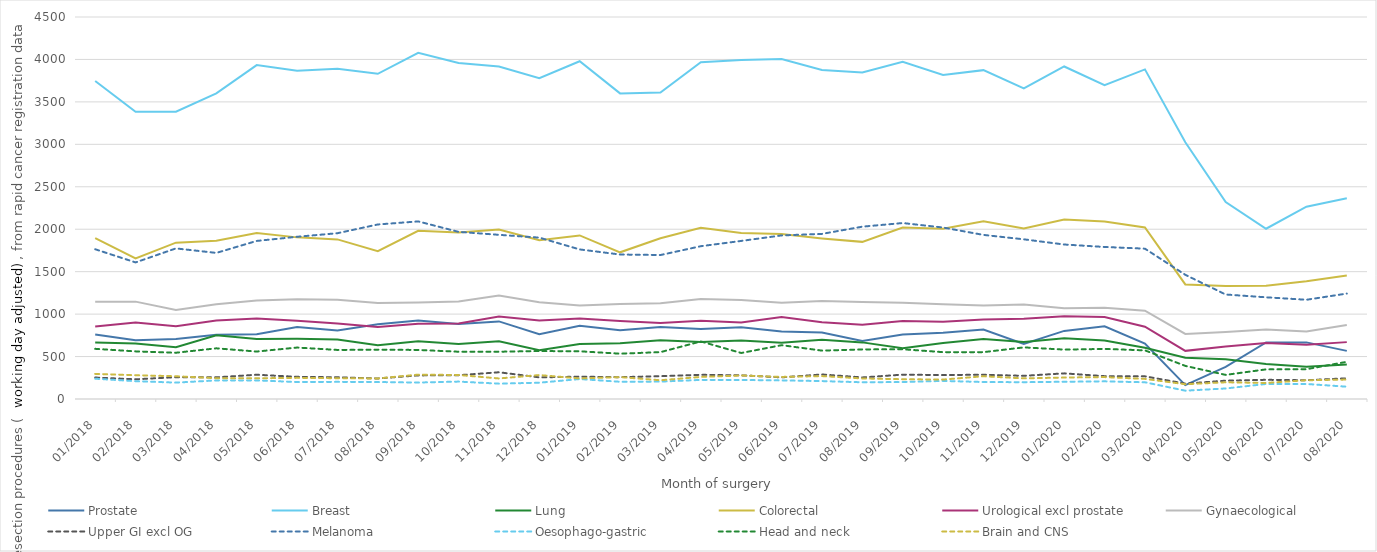
| Category | Prostate | Breast | Lung | Colorectal | Urological excl prostate | Gynaecological | Upper GI excl OG | Melanoma | Oesophago-gastric | Head and neck | Brain and CNS |
|---|---|---|---|---|---|---|---|---|---|---|---|
| 2018-01-01 | 761 | 3746 | 665 | 1895 | 854 | 1147 | 253 | 1764 | 239 | 591 | 296 |
| 2018-02-01 | 691 | 3384 | 655 | 1655 | 901 | 1147 | 232 | 1609 | 210 | 561 | 280 |
| 2018-03-01 | 706 | 3385 | 609 | 1842 | 856 | 1049 | 257 | 1774 | 193 | 545 | 268 |
| 2018-04-01 | 756 | 3600 | 751 | 1865 | 926 | 1116 | 255 | 1721 | 219 | 597 | 245 |
| 2018-05-01 | 764 | 3933 | 708 | 1954 | 947 | 1160 | 286 | 1862 | 219 | 559 | 244 |
| 2018-06-01 | 849 | 3867 | 709 | 1904 | 923 | 1176 | 261 | 1911 | 200 | 606 | 249 |
| 2018-07-01 | 807 | 3889 | 702 | 1880 | 888 | 1169 | 256 | 1953 | 202 | 578 | 245 |
| 2018-08-01 | 880 | 3831 | 634 | 1741 | 849 | 1131 | 242 | 2056 | 200 | 581 | 242 |
| 2018-09-01 | 925 | 4078 | 681 | 1981 | 887 | 1136 | 278 | 2092 | 194 | 578 | 287 |
| 2018-10-01 | 885 | 3959 | 648 | 1960 | 889 | 1148 | 280 | 1969 | 205 | 557 | 283 |
| 2018-11-01 | 914 | 3916 | 680 | 1996 | 972 | 1218 | 315 | 1934 | 181 | 557 | 242 |
| 2018-12-01 | 764 | 3779 | 575 | 1871 | 926 | 1141 | 255 | 1901 | 192 | 565 | 282 |
| 2019-01-01 | 863 | 3979 | 649 | 1927 | 949 | 1102 | 263 | 1762 | 235 | 562 | 242 |
| 2019-02-01 | 809 | 3600 | 656 | 1728 | 919 | 1118 | 257 | 1702 | 203 | 534 | 258 |
| 2019-03-01 | 847 | 3611 | 693 | 1894 | 896 | 1127 | 269 | 1696 | 205 | 552 | 221 |
| 2019-04-01 | 826 | 3967 | 671 | 2017 | 922 | 1179 | 285 | 1800 | 225 | 678 | 260 |
| 2019-05-01 | 845 | 3992 | 689 | 1955 | 900 | 1166 | 279 | 1862 | 224 | 542 | 277 |
| 2019-06-01 | 794 | 4004 | 662 | 1943 | 966 | 1133 | 255 | 1927 | 219 | 634 | 260 |
| 2019-07-01 | 782 | 3877 | 699 | 1892 | 905 | 1153 | 289 | 1945 | 211 | 570 | 270 |
| 2019-08-01 | 684 | 3847 | 667 | 1851 | 876 | 1142 | 254 | 2030 | 197 | 584 | 242 |
| 2019-09-01 | 761 | 3972 | 599 | 2020 | 919 | 1133 | 287 | 2073 | 200 | 586 | 233 |
| 2019-10-01 | 780 | 3818 | 660 | 2006 | 910 | 1116 | 282 | 2020 | 213 | 552 | 229 |
| 2019-11-01 | 818 | 3874 | 708 | 2095 | 937 | 1102 | 286 | 1933 | 200 | 552 | 268 |
| 2019-12-01 | 648 | 3658 | 672 | 2010 | 944 | 1113 | 273 | 1881 | 198 | 608 | 243 |
| 2020-01-01 | 802 | 3917 | 717 | 2114 | 976 | 1068 | 302 | 1820 | 203 | 582 | 253 |
| 2020-02-01 | 856 | 3697 | 690 | 2092 | 965 | 1076 | 269 | 1791 | 208 | 590 | 258 |
| 2020-03-01 | 653 | 3883 | 604 | 2021 | 851 | 1040 | 267 | 1771 | 197 | 573 | 237 |
| 2020-04-01 | 164 | 3025 | 487 | 1350 | 567 | 767 | 181 | 1463 | 98 | 390 | 174 |
| 2020-05-01 | 378 | 2321 | 468 | 1331 | 619 | 790 | 216 | 1231 | 124 | 284 | 197 |
| 2020-06-01 | 667 | 2006 | 411 | 1334 | 661 | 820 | 226 | 1198 | 177 | 349 | 189 |
| 2020-07-01 | 667 | 2265 | 381 | 1386 | 638 | 795 | 221 | 1169 | 177 | 351 | 221 |
| 2020-08-01 | 567 | 2364 | 405 | 1455 | 670 | 872 | 244 | 1242 | 145 | 438 | 229 |